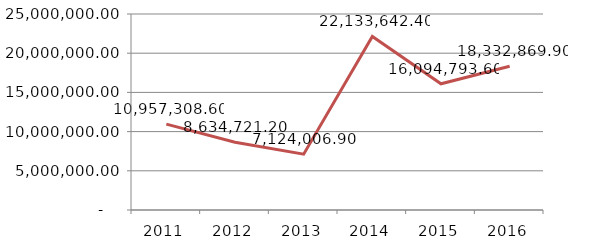
| Category | Valor dos contratos |
|---|---|
| 2011.0 | 10957308.6 |
| 2012.0 | 8634721.2 |
| 2013.0 | 7124006.9 |
| 2014.0 | 22133642.4 |
| 2015.0 | 16094793.6 |
| 2016.0 | 18332869.9 |